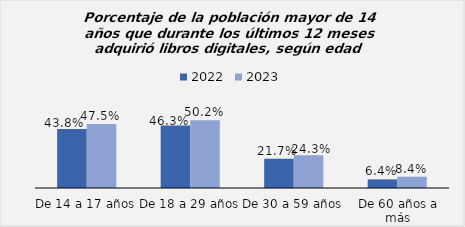
| Category | 2022 | 2023 |
|---|---|---|
| De 14 a 17 años | 0.438 | 0.475 |
| De 18 a 29 años | 0.463 | 0.502 |
| De 30 a 59 años | 0.217 | 0.242 |
| De 60 años a más | 0.064 | 0.084 |